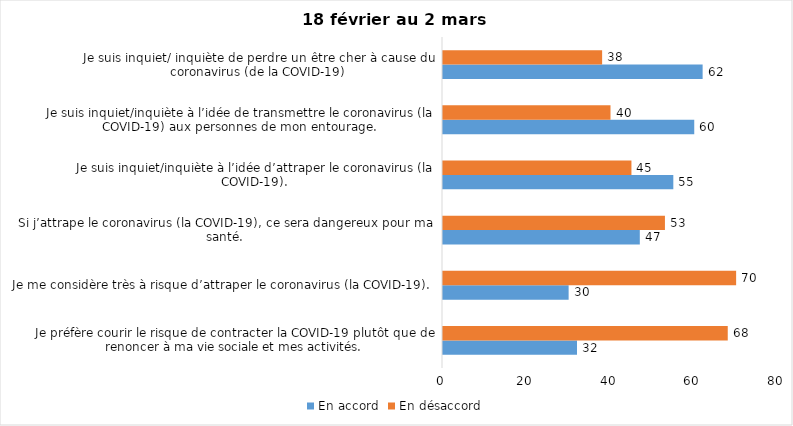
| Category | En accord | En désaccord |
|---|---|---|
| Je préfère courir le risque de contracter la COVID-19 plutôt que de renoncer à ma vie sociale et mes activités. | 32 | 68 |
| Je me considère très à risque d’attraper le coronavirus (la COVID-19). | 30 | 70 |
| Si j’attrape le coronavirus (la COVID-19), ce sera dangereux pour ma santé. | 47 | 53 |
| Je suis inquiet/inquiète à l’idée d’attraper le coronavirus (la COVID-19). | 55 | 45 |
| Je suis inquiet/inquiète à l’idée de transmettre le coronavirus (la COVID-19) aux personnes de mon entourage. | 60 | 40 |
| Je suis inquiet/ inquiète de perdre un être cher à cause du coronavirus (de la COVID-19) | 62 | 38 |